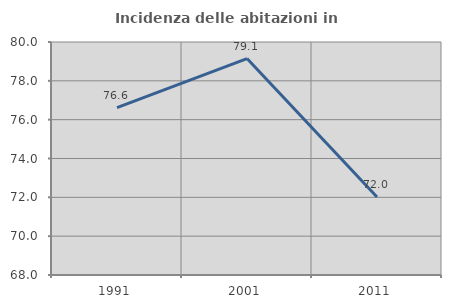
| Category | Incidenza delle abitazioni in proprietà  |
|---|---|
| 1991.0 | 76.622 |
| 2001.0 | 79.148 |
| 2011.0 | 72.018 |